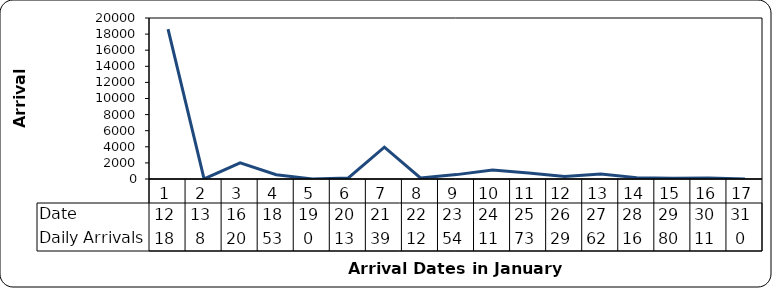
| Category | Date | Daily Arrivals |
|---|---|---|
| 0 | 12 | 18616 |
| 1 | 13 | 8 |
| 2 | 16 | 2000 |
| 3 | 18 | 532 |
| 4 | 19 | 0 |
| 5 | 20 | 130 |
| 6 | 21 | 3948 |
| 7 | 22 | 127 |
| 8 | 23 | 545 |
| 9 | 24 | 1123 |
| 10 | 25 | 738 |
| 11 | 26 | 298 |
| 12 | 27 | 621 |
| 13 | 28 | 167 |
| 14 | 29 | 80 |
| 15 | 30 | 119 |
| 16 | 31 | 0 |